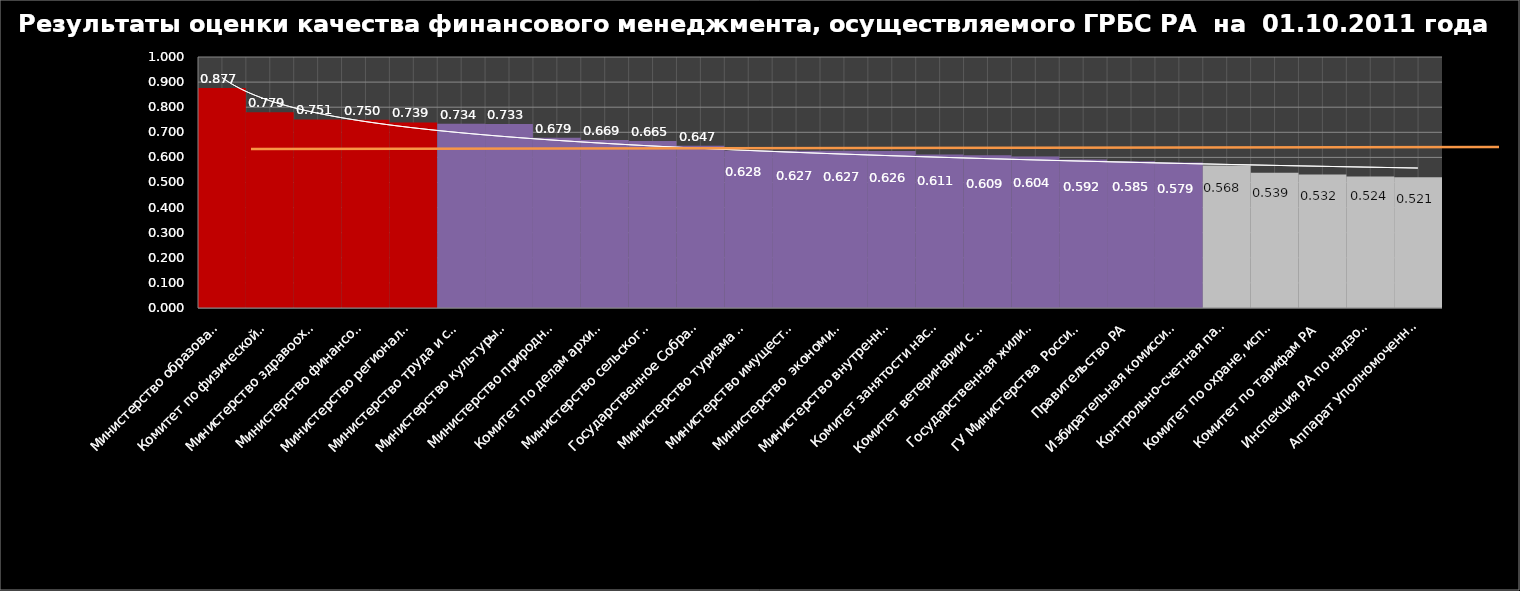
| Category | Series 0 |
|---|---|
| Министерство образования, науки и молодежной политики  РА | 0.877 |
| Комитет по физической культуре и спорту РА | 0.779 |
| Министерство здравоохранения РА | 0.751 |
| Министерство финансов РА | 0.75 |
| Министерство регионального развития РА | 0.739 |
| Министерство труда и социального развития РА | 0.734 |
| Министерство культуры РА | 0.733 |
| Министерство природных ресурсов РА | 0.679 |
| Комитет по делам архивов РА | 0.669 |
| Министерство сельского хозяйства РА | 0.665 |
| Государственное Собрание - Эл Курултай РА | 0.647 |
| Министерство туризма и  предпринимательства РА | 0.628 |
| Министерство имущественных отношений РА | 0.627 |
| Министерство  экономического  развития и инвестиций РА | 0.627 |
| Министерство внутренних дел по РА | 0.626 |
| Комитет занятости населения РА | 0.611 |
| Комитет ветеринарии с Госветинспекцией РА | 0.609 |
| Государственная жилищная инспекция РА | 0.604 |
| ГУ Министерства  Российской Федерации по делам гражданской обороны, чрезвычайным ситуациям и ликвидации последствий стихийных бедствий по РА | 0.592 |
| Правительство РА | 0.585 |
| Избирательная комиссия РА | 0.579 |
| Контрольно-счетная палата РА | 0.568 |
| Комитет по охране, использованию и воспроизводству объектов животного мира РА | 0.539 |
| Комитет по тарифам РА | 0.532 |
| Инспекция РА по надзору за техническим состоянием самоходных машин и других видов техники | 0.524 |
| Аппарат Уполномоченного по правам человека в РА | 0.521 |